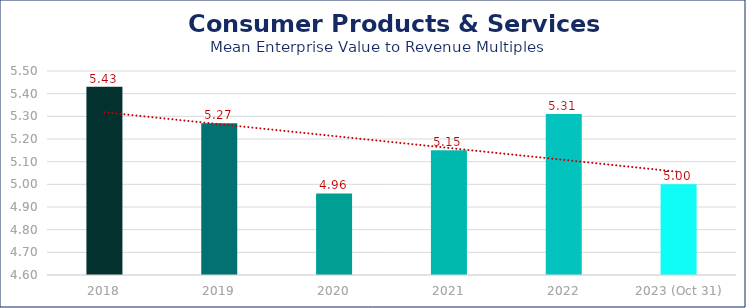
| Category | Consumer Products & Services |
|---|---|
| 2018 | 5.43 |
| 2019 | 5.27 |
| 2020 | 4.96 |
| 2021 | 5.15 |
| 2022 | 5.31 |
| 2023 (Oct 31) | 5 |